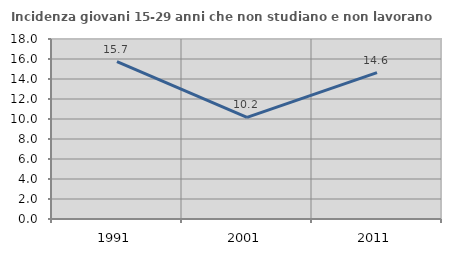
| Category | Incidenza giovani 15-29 anni che non studiano e non lavorano  |
|---|---|
| 1991.0 | 15.726 |
| 2001.0 | 10.169 |
| 2011.0 | 14.634 |